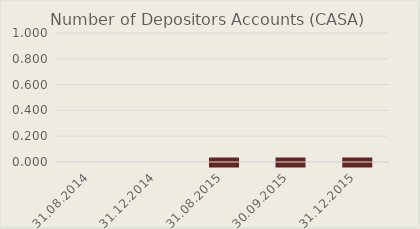
| Category | Number of Depositors Accounts (CASA) |
|---|---|
| 31.08.2014 | 0 |
| 31.12.2014 | 0 |
| 31.08.2015 | 0 |
| 30.09.2015 | 0 |
| 31.12.2015 | 0 |